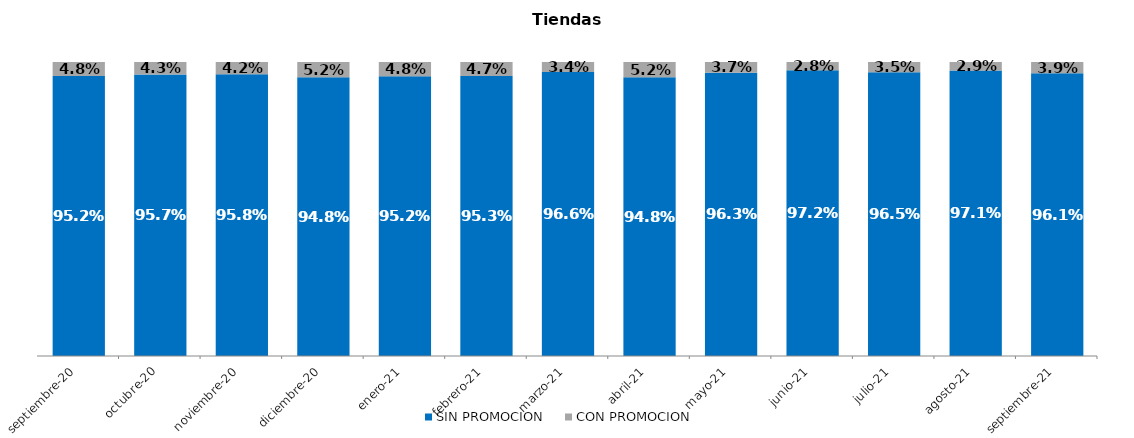
| Category | SIN PROMOCION   | CON PROMOCION   |
|---|---|---|
| 2020-09-01 | 0.952 | 0.048 |
| 2020-10-01 | 0.957 | 0.043 |
| 2020-11-01 | 0.958 | 0.042 |
| 2020-12-01 | 0.948 | 0.052 |
| 2021-01-01 | 0.952 | 0.048 |
| 2021-02-01 | 0.953 | 0.047 |
| 2021-03-01 | 0.966 | 0.034 |
| 2021-04-01 | 0.948 | 0.052 |
| 2021-05-01 | 0.963 | 0.037 |
| 2021-06-01 | 0.972 | 0.028 |
| 2021-07-01 | 0.965 | 0.035 |
| 2021-08-01 | 0.971 | 0.029 |
| 2021-09-01 | 0.961 | 0.039 |